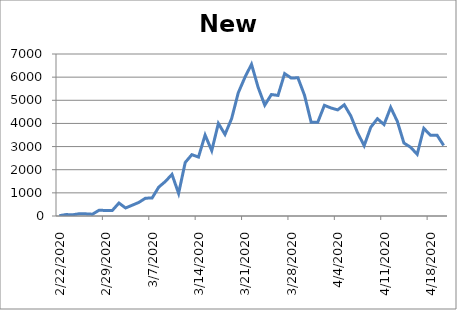
| Category | New Cases |
|---|---|
| 2/22/20 | 14 |
| 2/23/20 | 62 |
| 2/24/20 | 53 |
| 2/25/20 | 97 |
| 2/26/20 | 93 |
| 2/27/20 | 78 |
| 2/28/20 | 250 |
| 2/29/20 | 238 |
| 3/1/20 | 240 |
| 3/2/20 | 561 |
| 3/3/20 | 347 |
| 3/4/20 | 466 |
| 3/5/20 | 587 |
| 3/6/20 | 769 |
| 3/7/20 | 778 |
| 3/8/20 | 1247 |
| 3/9/20 | 1492 |
| 3/10/20 | 1797 |
| 3/11/20 | 977 |
| 3/12/20 | 2313 |
| 3/13/20 | 2651 |
| 3/14/20 | 2547 |
| 3/15/20 | 3497 |
| 3/16/20 | 2823 |
| 3/17/20 | 4000 |
| 3/18/20 | 3526 |
| 3/19/20 | 4207 |
| 3/20/20 | 5322 |
| 3/21/20 | 5986 |
| 3/22/20 | 6557 |
| 3/23/20 | 5560 |
| 3/24/20 | 4789 |
| 3/25/20 | 5249 |
| 3/26/20 | 5210 |
| 3/27/20 | 6153 |
| 3/28/20 | 5959 |
| 3/29/20 | 5974 |
| 3/30/20 | 5217 |
| 3/31/20 | 4050 |
| 4/1/20 | 4053 |
| 4/2/20 | 4782 |
| 4/3/20 | 4668 |
| 4/4/20 | 4585 |
| 4/5/20 | 4805 |
| 4/6/20 | 4316 |
| 4/7/20 | 3599 |
| 4/8/20 | 3039 |
| 4/9/20 | 3836 |
| 4/10/20 | 4204 |
| 4/11/20 | 3951 |
| 4/12/20 | 4694 |
| 4/13/20 | 4092 |
| 4/14/20 | 3153 |
| 4/15/20 | 2972 |
| 4/16/20 | 2667 |
| 4/17/20 | 3786 |
| 4/18/20 | 3493 |
| 4/19/20 | 3491 |
| 4/20/20 | 3047 |